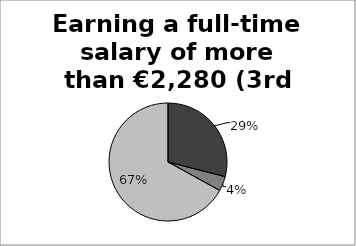
| Category | Earning a full-time salary of more than €2,280 (3rd quartile) |
|---|---|
| 0 | 0.29 |
| 1 | 0.04 |
| 2 | 0.67 |